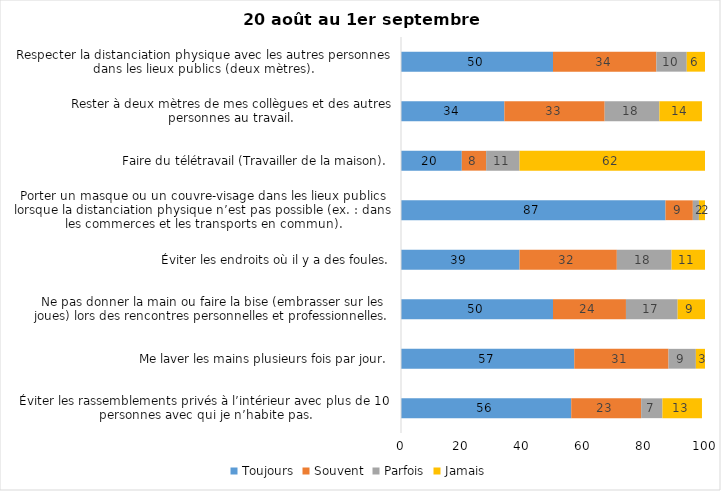
| Category | Toujours | Souvent | Parfois | Jamais |
|---|---|---|---|---|
| Éviter les rassemblements privés à l’intérieur avec plus de 10 personnes avec qui je n’habite pas. | 56 | 23 | 7 | 13 |
| Me laver les mains plusieurs fois par jour. | 57 | 31 | 9 | 3 |
| Ne pas donner la main ou faire la bise (embrasser sur les joues) lors des rencontres personnelles et professionnelles. | 50 | 24 | 17 | 9 |
| Éviter les endroits où il y a des foules. | 39 | 32 | 18 | 11 |
| Porter un masque ou un couvre-visage dans les lieux publics lorsque la distanciation physique n’est pas possible (ex. : dans les commerces et les transports en commun). | 87 | 9 | 2 | 2 |
| Faire du télétravail (Travailler de la maison). | 20 | 8 | 11 | 62 |
| Rester à deux mètres de mes collègues et des autres personnes au travail. | 34 | 33 | 18 | 14 |
| Respecter la distanciation physique avec les autres personnes dans les lieux publics (deux mètres). | 50 | 34 | 10 | 6 |